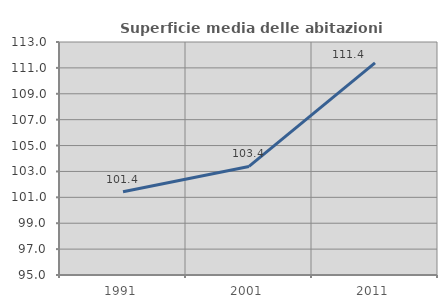
| Category | Superficie media delle abitazioni occupate |
|---|---|
| 1991.0 | 101.438 |
| 2001.0 | 103.385 |
| 2011.0 | 111.388 |